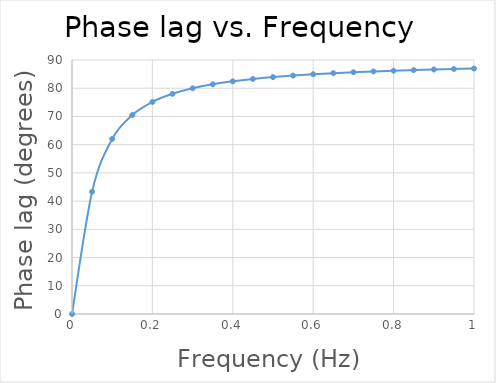
| Category | Series 0 |
|---|---|
| 0.0 | 0 |
| 0.05 | 43.304 |
| 0.1 | 62.053 |
| 0.15 | 70.522 |
| 0.2 | 75.144 |
| 0.25 | 78.019 |
| 0.3 | 79.972 |
| 0.35 | 81.381 |
| 0.4 | 82.445 |
| 0.45 | 83.276 |
| 0.5 | 83.943 |
| 0.55 | 84.49 |
| 0.6 | 84.947 |
| 0.65 | 85.334 |
| 0.7 | 85.666 |
| 0.75 | 85.954 |
| 0.8 | 86.206 |
| 0.85 | 86.429 |
| 0.9 | 86.627 |
| 0.95 | 86.804 |
| 1.0 | 86.963 |